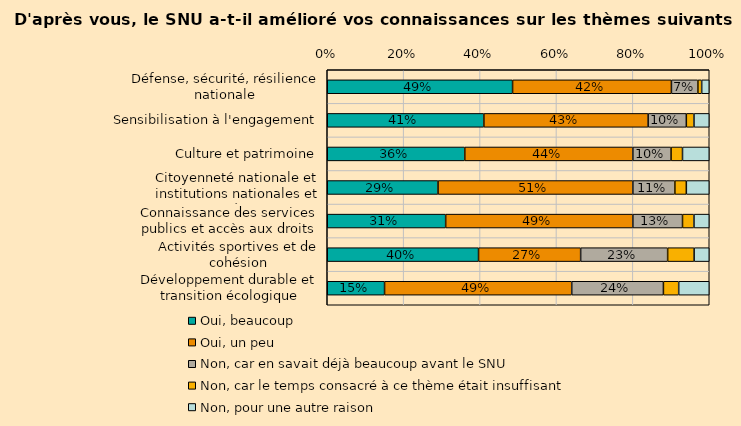
| Category | Oui, beaucoup | Oui, un peu | Non, car en savait déjà beaucoup avant le SNU | Non, car le temps consacré à ce thème était insuffisant | Non, pour une autre raison |
|---|---|---|---|---|---|
| Défense, sécurité, résilience nationale | 0.49 | 0.42 | 0.07 | 0.01 | 0.02 |
| Sensibilisation à l'engagement | 0.41 | 0.43 | 0.1 | 0.02 | 0.04 |
| Culture et patrimoine | 0.36 | 0.44 | 0.1 | 0.03 | 0.07 |
| Citoyenneté nationale et institutions nationales et européennes | 0.29 | 0.51 | 0.11 | 0.03 | 0.06 |
| Connaissance des services publics et accès aux droits | 0.31 | 0.49 | 0.13 | 0.03 | 0.04 |
| Activités sportives et de cohésion | 0.4 | 0.27 | 0.23 | 0.07 | 0.04 |
| Développement durable et transition écologique | 0.15 | 0.49 | 0.24 | 0.04 | 0.08 |